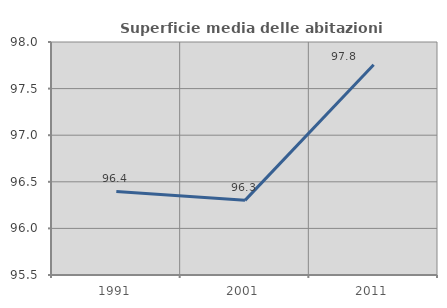
| Category | Superficie media delle abitazioni occupate |
|---|---|
| 1991.0 | 96.397 |
| 2001.0 | 96.301 |
| 2011.0 | 97.757 |